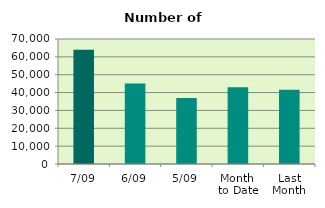
| Category | Series 0 |
|---|---|
| 7/09 | 63990 |
| 6/09 | 45108 |
| 5/09 | 36910 |
| Month 
to Date | 42944 |
| Last
Month | 41597.13 |